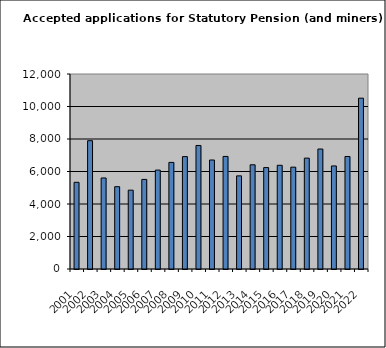
| Category | Series 1 |
|---|---|
| 2001.0 | 5335 |
| 2002.0 | 7897 |
| 2003.0 | 5601 |
| 2004.0 | 5065 |
| 2005.0 | 4851 |
| 2006.0 | 5513 |
| 2007.0 | 6086 |
| 2008.0 | 6559 |
| 2009.0 | 6917 |
| 2010.0 | 7601 |
| 2011.0 | 6707 |
| 2012.0 | 6926 |
| 2013.0 | 5731 |
| 2014.0 | 6413 |
| 2015.0 | 6241 |
| 2016.0 | 6382 |
| 2017.0 | 6267 |
| 2018.0 | 6822 |
| 2019.0 | 7383 |
| 2020.0 | 6342 |
| 2021.0 | 6924 |
| 2022.0 | 10512 |